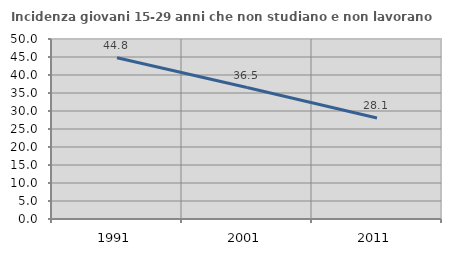
| Category | Incidenza giovani 15-29 anni che non studiano e non lavorano  |
|---|---|
| 1991.0 | 44.795 |
| 2001.0 | 36.52 |
| 2011.0 | 28.055 |